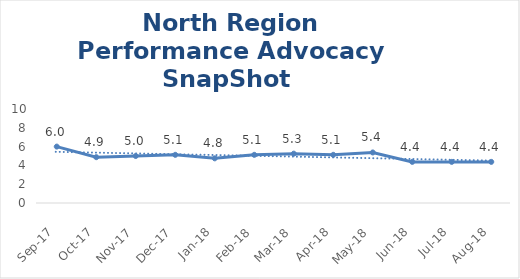
| Category | North Region |
|---|---|
| Sep-17 | 6 |
| Oct-17 | 4.875 |
| Nov-17 | 5 |
| Dec-17 | 5.125 |
| Jan-18 | 4.75 |
| Feb-18 | 5.125 |
| Mar-18 | 5.25 |
| Apr-18 | 5.125 |
| May-18 | 5.375 |
| Jun-18 | 4.375 |
| Jul-18 | 4.375 |
| Aug-18 | 4.375 |